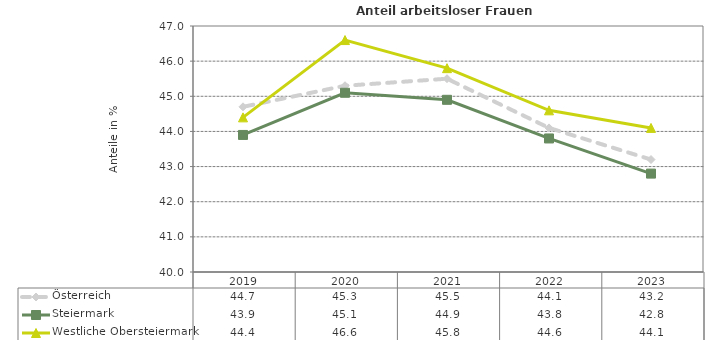
| Category | Österreich | Steiermark | Westliche Obersteiermark |
|---|---|---|---|
| 2023.0 | 43.2 | 42.8 | 44.1 |
| 2022.0 | 44.1 | 43.8 | 44.6 |
| 2021.0 | 45.5 | 44.9 | 45.8 |
| 2020.0 | 45.3 | 45.1 | 46.6 |
| 2019.0 | 44.7 | 43.9 | 44.4 |